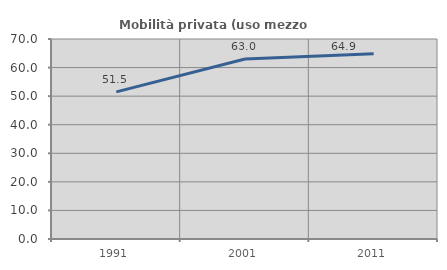
| Category | Mobilità privata (uso mezzo privato) |
|---|---|
| 1991.0 | 51.49 |
| 2001.0 | 62.975 |
| 2011.0 | 64.873 |